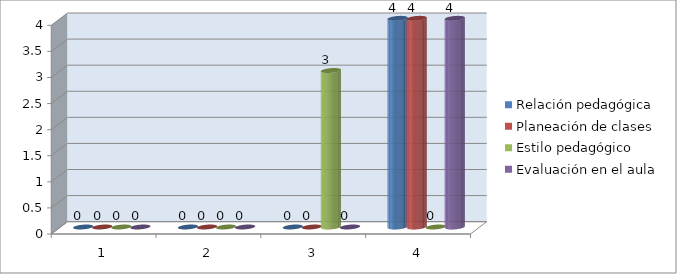
| Category | Relación pedagógica | Planeación de clases | Estilo pedagógico | Evaluación en el aula |
|---|---|---|---|---|
| 0 | 0 | 0 | 0 | 0 |
| 1 | 0 | 0 | 0 | 0 |
| 2 | 0 | 0 | 3 | 0 |
| 3 | 4 | 4 | 0 | 4 |